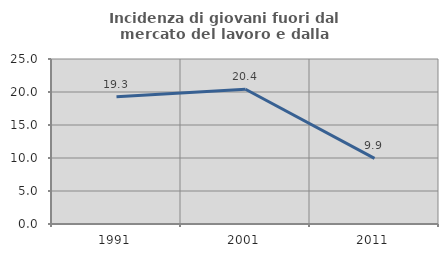
| Category | Incidenza di giovani fuori dal mercato del lavoro e dalla formazione  |
|---|---|
| 1991.0 | 19.293 |
| 2001.0 | 20.419 |
| 2011.0 | 9.938 |